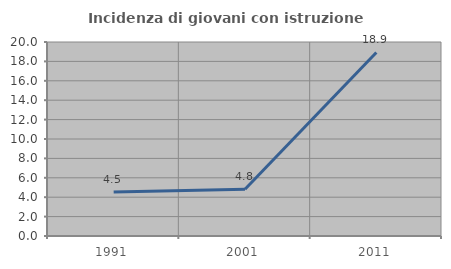
| Category | Incidenza di giovani con istruzione universitaria |
|---|---|
| 1991.0 | 4.545 |
| 2001.0 | 4.819 |
| 2011.0 | 18.919 |